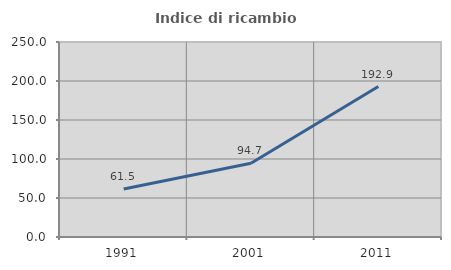
| Category | Indice di ricambio occupazionale  |
|---|---|
| 1991.0 | 61.481 |
| 2001.0 | 94.655 |
| 2011.0 | 192.874 |